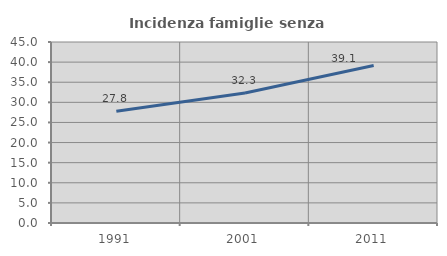
| Category | Incidenza famiglie senza nuclei |
|---|---|
| 1991.0 | 27.804 |
| 2001.0 | 32.324 |
| 2011.0 | 39.142 |